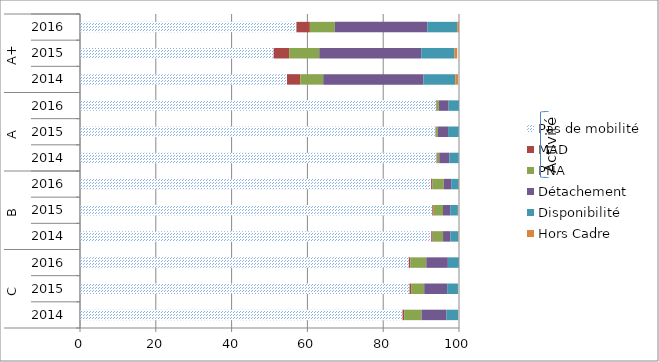
| Category | Pas de mobilité | MAD | PNA | Détachement | Disponibilité | Hors Cadre |
|---|---|---|---|---|---|---|
| 0 | 85.108 | 0.437 | 4.576 | 6.583 | 3.05 | 0.043 |
| 1 | 86.948 | 0.428 | 3.444 | 6.055 | 2.851 | 0.043 |
| 2 | 86.77 | 0.406 | 4.195 | 5.692 | 2.896 | 0.041 |
| 3 | 92.679 | 0.372 | 2.743 | 1.965 | 2.029 | 0.099 |
| 4 | 92.953 | 0.333 | 2.485 | 1.906 | 2.033 | 0.095 |
| 5 | 92.647 | 0.367 | 2.981 | 1.963 | 1.951 | 0.092 |
| 6 | 94.071 | 0.129 | 0.592 | 2.65 | 2.471 | 0.026 |
| 7 | 93.8 | 0.1 | 0.519 | 2.7 | 2.8 | 0 |
| 8 | 93.927 | 0.143 | 0.591 | 2.597 | 2.72 | 0.022 |
| 9 | 54.61 | 3.493 | 6.073 | 26.444 | 8.4 | 0.734 |
| 10 | 51.1 | 4.1 | 7.929 | 26.9 | 8.8 | 0.7 |
| 11 | 57.105 | 3.545 | 6.597 | 24.393 | 7.912 | 0.449 |